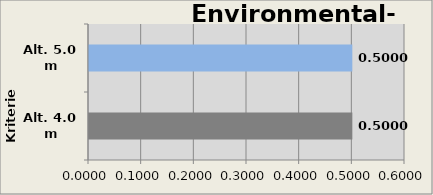
| Category | Env. Impact |
|---|---|
| Alt. 4.0 m | 0.5 |
| Alt. 5.0 m | 0.5 |